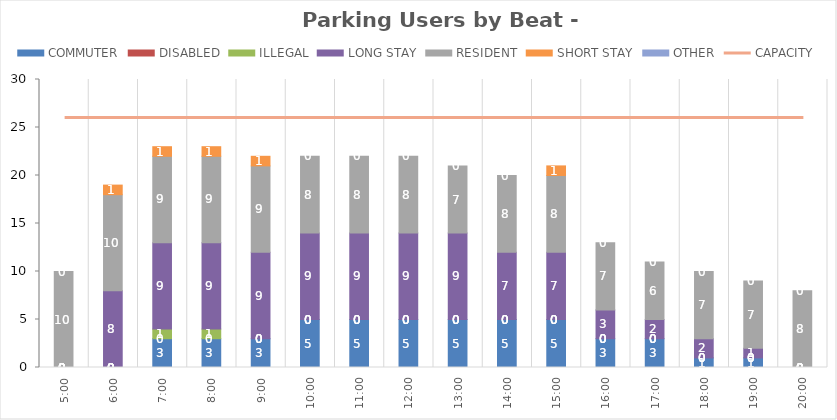
| Category | COMMUTER | DISABLED | ILLEGAL | LONG STAY | RESIDENT | SHORT STAY | OTHER |
|---|---|---|---|---|---|---|---|
| 0.20833333333333334 | 0 | 0 | 0 | 0 | 10 | 0 | 0 |
| 0.25 | 0 | 0 | 0 | 8 | 10 | 1 | 0 |
| 0.2916666666666667 | 3 | 0 | 1 | 9 | 9 | 1 | 0 |
| 0.3333333333333333 | 3 | 0 | 1 | 9 | 9 | 1 | 0 |
| 0.375 | 3 | 0 | 0 | 9 | 9 | 1 | 0 |
| 0.4166666666666667 | 5 | 0 | 0 | 9 | 8 | 0 | 0 |
| 0.4583333333333333 | 5 | 0 | 0 | 9 | 8 | 0 | 0 |
| 0.5 | 5 | 0 | 0 | 9 | 8 | 0 | 0 |
| 0.5416666666666666 | 5 | 0 | 0 | 9 | 7 | 0 | 0 |
| 0.5833333333333334 | 5 | 0 | 0 | 7 | 8 | 0 | 0 |
| 0.625 | 5 | 0 | 0 | 7 | 8 | 1 | 0 |
| 0.6666666666666666 | 3 | 0 | 0 | 3 | 7 | 0 | 0 |
| 0.7083333333333334 | 3 | 0 | 0 | 2 | 6 | 0 | 0 |
| 0.75 | 1 | 0 | 0 | 2 | 7 | 0 | 0 |
| 0.7916666666666666 | 1 | 0 | 0 | 1 | 7 | 0 | 0 |
| 0.8333333333333334 | 0 | 0 | 0 | 0 | 8 | 0 | 0 |